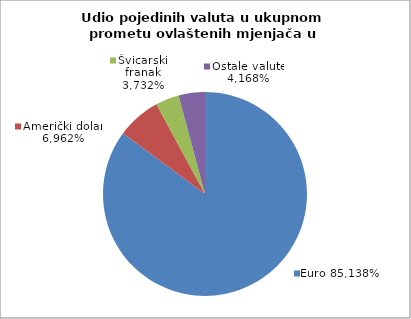
| Category | EUR |
|---|---|
| 0 | 0.851 |
| 1 | 0.07 |
| 2 | 0.037 |
| 3 | 0.042 |